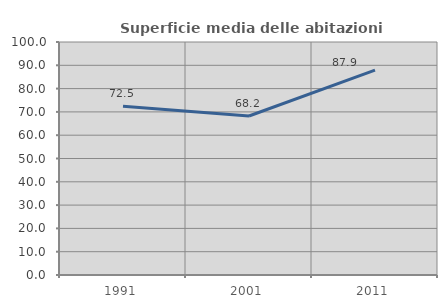
| Category | Superficie media delle abitazioni occupate |
|---|---|
| 1991.0 | 72.458 |
| 2001.0 | 68.241 |
| 2011.0 | 87.903 |